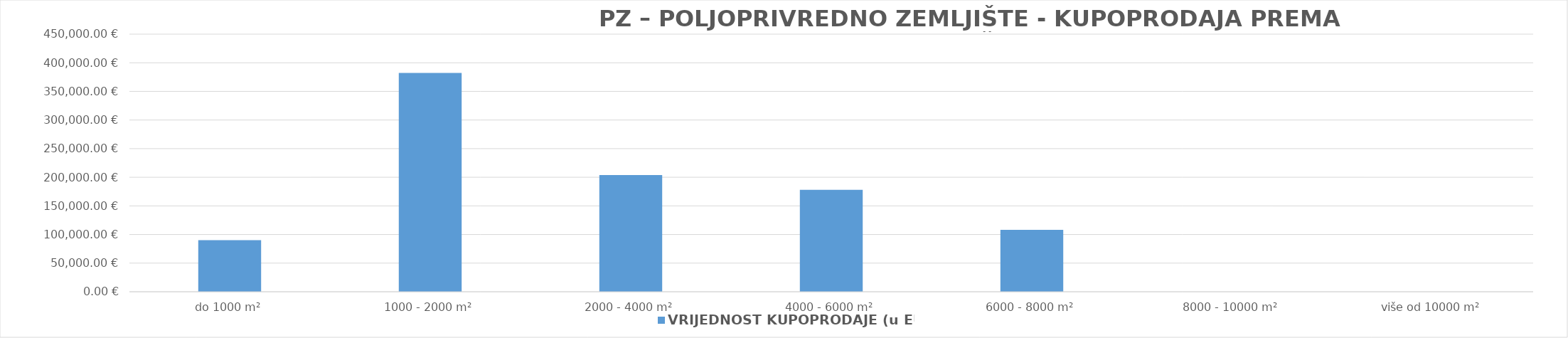
| Category | VRIJEDNOST KUPOPRODAJE (u EUR) |
|---|---|
| do 1000 m² | 90244.448 |
| 1000 - 2000 m² | 382312.006 |
| 2000 - 4000 m² | 203871.741 |
| 4000 - 6000 m² | 178008.273 |
| 6000 - 8000 m² | 108006.79 |
| 8000 - 10000 m² | 0 |
| više od 10000 m² | 0 |